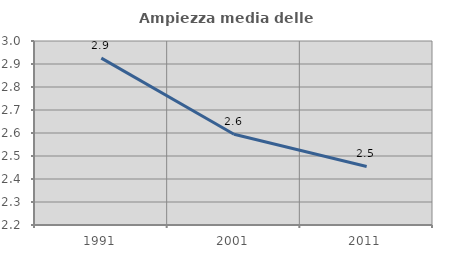
| Category | Ampiezza media delle famiglie |
|---|---|
| 1991.0 | 2.926 |
| 2001.0 | 2.595 |
| 2011.0 | 2.454 |